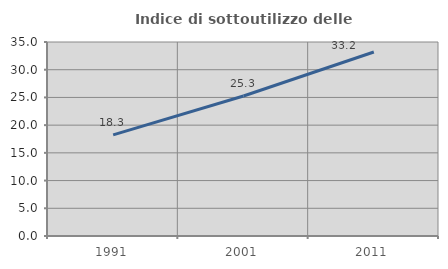
| Category | Indice di sottoutilizzo delle abitazioni  |
|---|---|
| 1991.0 | 18.251 |
| 2001.0 | 25.265 |
| 2011.0 | 33.193 |